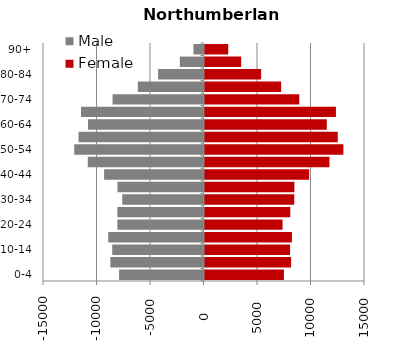
| Category | Female | Male |
|---|---|---|
| 0-4 | 7422 | -7894 |
| 5-9 | 8090 | -8706 |
| 10-14 | 8000 | -8530 |
| 15-19 | 8172 | -8905 |
| 20-24 | 7297 | -8050 |
| 25-29 | 8017 | -8051 |
| 30-34 | 8388 | -7597 |
| 35-39 | 8402 | -8039 |
| 40-44 | 9780 | -9288 |
| 45-49 | 11678 | -10815 |
| 50-54 | 12979 | -12081 |
| 55-59 | 12454 | -11680 |
| 60-64 | 11431 | -10796 |
| 65-69 | 12283 | -11447 |
| 70-74 | 8857 | -8499 |
| 75-79 | 7161 | -6141 |
| 80-84 | 5293 | -4243 |
| 85-89 | 3427 | -2210 |
| 90+ | 2218 | -942 |